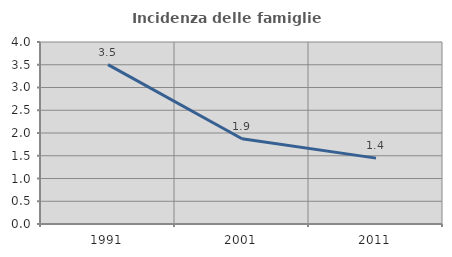
| Category | Incidenza delle famiglie numerose |
|---|---|
| 1991.0 | 3.502 |
| 2001.0 | 1.874 |
| 2011.0 | 1.448 |